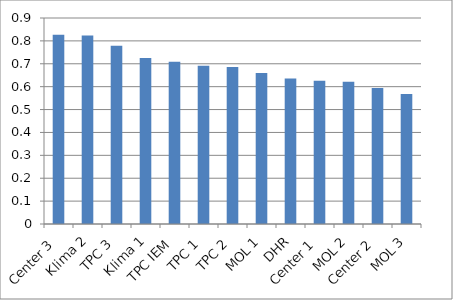
| Category | Series 0 |
|---|---|
| Center 3 | 0.826 |
| Klima 2 | 0.824 |
| TPC 3 | 0.778 |
| Klima 1 | 0.725 |
| TPC IEM | 0.709 |
| TPC 1 | 0.691 |
| TPC 2 | 0.686 |
| MOL 1 | 0.66 |
| DHR | 0.636 |
| Center 1 | 0.626 |
| MOL 2 | 0.622 |
| Center 2 | 0.594 |
| MOL 3 | 0.568 |